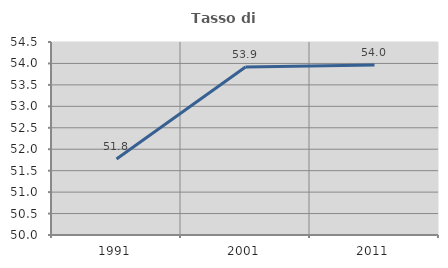
| Category | Tasso di occupazione   |
|---|---|
| 1991.0 | 51.771 |
| 2001.0 | 53.919 |
| 2011.0 | 53.963 |